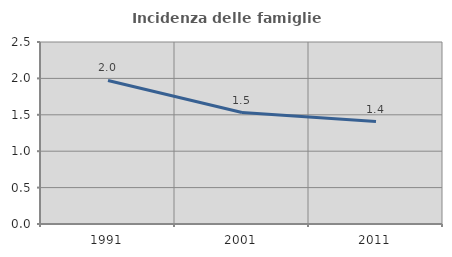
| Category | Incidenza delle famiglie numerose |
|---|---|
| 1991.0 | 1.972 |
| 2001.0 | 1.531 |
| 2011.0 | 1.406 |